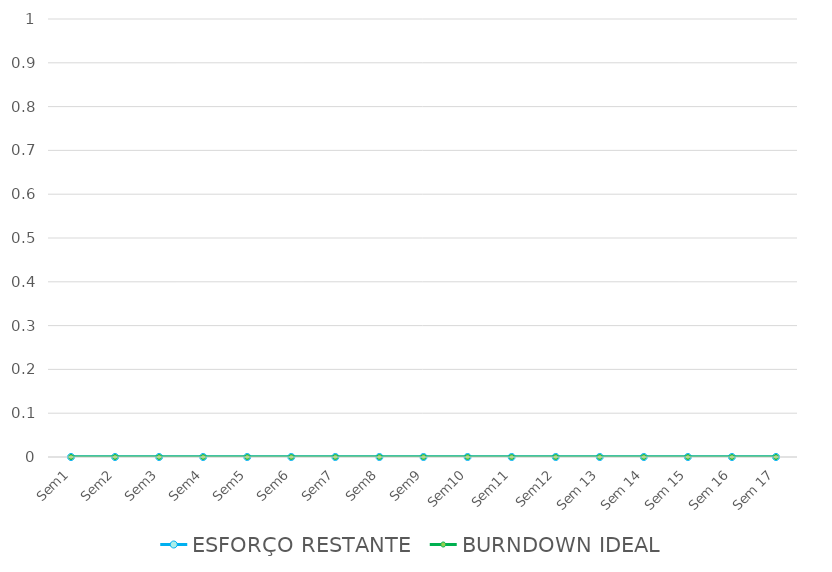
| Category | ESFORÇO RESTANTE | BURNDOWN IDEAL |
|---|---|---|
| Sem1 | 0 | 0 |
| Sem2 | 0 | 0 |
| Sem3 | 0 | 0 |
| Sem4 | 0 | 0 |
| Sem5 | 0 | 0 |
| Sem6 | 0 | 0 |
| Sem7 | 0 | 0 |
| Sem8 | 0 | 0 |
| Sem9 | 0 | 0 |
| Sem10 | 0 | 0 |
| Sem11 | 0 | 0 |
| Sem12 | 0 | 0 |
| Sem 13 | 0 | 0 |
| Sem 14 | 0 | 0 |
| Sem 15 | 0 | 0 |
| Sem 16 | 0 | 0 |
| Sem 17 | 0 | 0 |